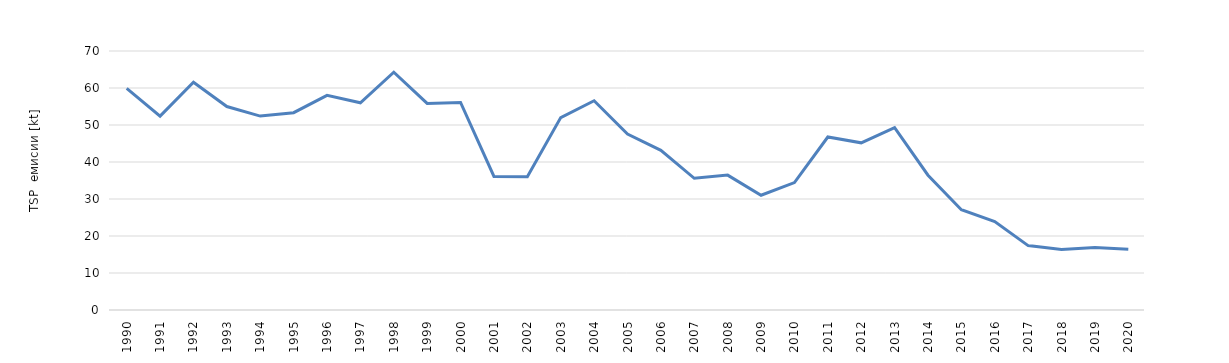
| Category | Series 0 |
|---|---|
| 1990 | 59.88 |
| 1991 | 52.405 |
| 1992 | 61.537 |
| 1993 | 54.983 |
| 1994 | 52.407 |
| 1995 | 53.33 |
| 1996 | 58.024 |
| 1997 | 56.013 |
| 1998 | 64.269 |
| 1999 | 55.835 |
| 2000 | 56.091 |
| 2001 | 36.086 |
| 2002 | 35.992 |
| 2003 | 52.01 |
| 2004 | 56.549 |
| 2005 | 47.57 |
| 2006 | 43.138 |
| 2007 | 35.596 |
| 2008 | 36.454 |
| 2009 | 31.009 |
| 2010 | 34.437 |
| 2011 | 46.757 |
| 2012 | 45.177 |
| 2013 | 49.305 |
| 2014 | 36.439 |
| 2015 | 27.094 |
| 2016 | 23.919 |
| 2017 | 17.408 |
| 2018 | 16.351 |
| 2019 | 16.873 |
| 2020 | 16.41 |